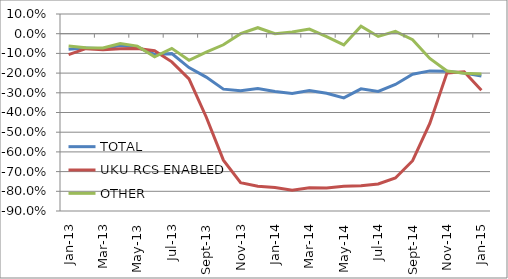
| Category | TOTAL | UKU RCS ENABLED | OTHER |
|---|---|---|---|
| 2013-01-01 | -0.079 | -0.106 | -0.062 |
| 2013-02-01 | -0.073 | -0.076 | -0.071 |
| 2013-03-01 | -0.076 | -0.082 | -0.073 |
| 2013-04-01 | -0.06 | -0.077 | -0.05 |
| 2013-05-01 | -0.068 | -0.075 | -0.063 |
| 2013-06-01 | -0.105 | -0.086 | -0.117 |
| 2013-07-01 | -0.101 | -0.143 | -0.074 |
| 2013-08-01 | -0.172 | -0.23 | -0.135 |
| 2013-09-01 | -0.22 | -0.423 | -0.094 |
| 2013-10-01 | -0.281 | -0.642 | -0.056 |
| 2013-11-01 | -0.289 | -0.756 | 0 |
| 2013-12-01 | -0.279 | -0.774 | 0.03 |
| 2014-01-01 | -0.294 | -0.781 | 0 |
| 2014-02-01 | -0.304 | -0.795 | 0.009 |
| 2014-03-01 | -0.288 | -0.782 | 0.023 |
| 2014-04-01 | -0.302 | -0.784 | -0.015 |
| 2014-05-01 | -0.326 | -0.774 | -0.057 |
| 2014-06-01 | -0.28 | -0.772 | 0.038 |
| 2014-07-01 | -0.293 | -0.763 | -0.014 |
| 2014-08-01 | -0.258 | -0.732 | 0.012 |
| 2014-09-01 | -0.205 | -0.645 | -0.03 |
| 2014-10-01 | -0.189 | -0.455 | -0.126 |
| 2014-11-01 | -0.19 | -0.199 | -0.189 |
| 2014-12-01 | -0.2 | -0.193 | -0.201 |
| 2015-01-01 | -0.215 | -0.287 | -0.205 |